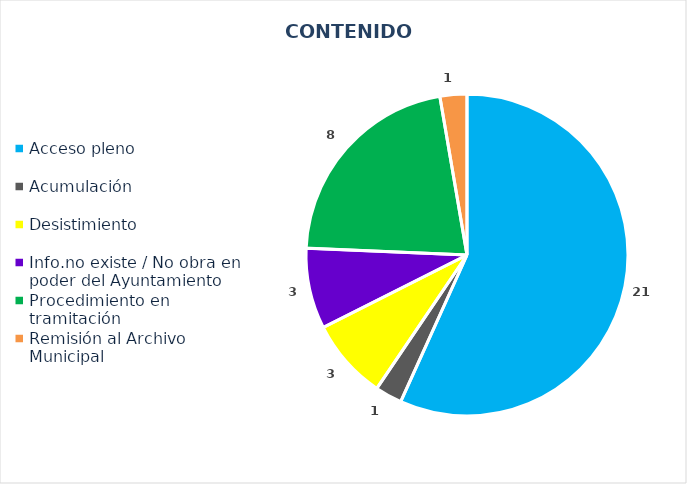
| Category | NÚMERO |
|---|---|
| Acceso pleno | 21 |
| Acumulación | 1 |
| Desistimiento | 3 |
| Info.no existe / No obra en poder del Ayuntamiento | 3 |
| Procedimiento en tramitación | 8 |
| Remisión al Archivo Municipal | 1 |